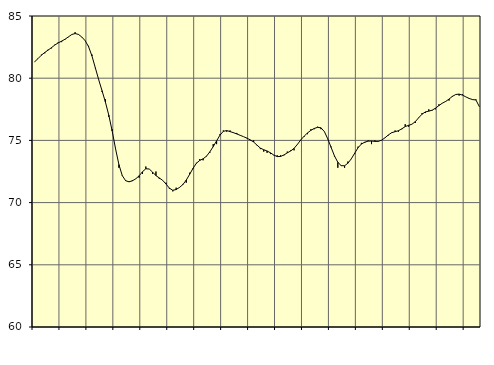
| Category | Piggar | Series 1 |
|---|---|---|
| nan | 81.3 | 81.32 |
| 87.0 | 81.6 | 81.58 |
| 87.0 | 81.9 | 81.85 |
| 87.0 | 82 | 82.07 |
| nan | 82.3 | 82.26 |
| 88.0 | 82.4 | 82.46 |
| 88.0 | 82.7 | 82.67 |
| 88.0 | 82.9 | 82.84 |
| nan | 82.9 | 82.98 |
| 89.0 | 83.1 | 83.13 |
| 89.0 | 83.3 | 83.32 |
| 89.0 | 83.5 | 83.51 |
| nan | 83.7 | 83.59 |
| 90.0 | 83.5 | 83.52 |
| 90.0 | 83.3 | 83.31 |
| 90.0 | 83 | 83.01 |
| nan | 82.6 | 82.53 |
| 91.0 | 81.9 | 81.79 |
| 91.0 | 80.8 | 80.84 |
| 91.0 | 79.9 | 79.88 |
| nan | 78.9 | 78.99 |
| 92.0 | 78.3 | 78.08 |
| 92.0 | 76.9 | 77.03 |
| 92.0 | 75.9 | 75.76 |
| nan | 74.4 | 74.34 |
| 93.0 | 72.8 | 73.06 |
| 93.0 | 72.2 | 72.17 |
| 93.0 | 71.8 | 71.76 |
| nan | 71.7 | 71.67 |
| 94.0 | 71.8 | 71.75 |
| 94.0 | 71.9 | 71.91 |
| 94.0 | 72 | 72.15 |
| nan | 72.3 | 72.48 |
| 95.0 | 72.9 | 72.72 |
| 95.0 | 72.7 | 72.7 |
| 95.0 | 72.3 | 72.45 |
| nan | 72.5 | 72.17 |
| 96.0 | 71.9 | 71.98 |
| 96.0 | 71.8 | 71.79 |
| 96.0 | 71.6 | 71.49 |
| nan | 71.1 | 71.16 |
| 97.0 | 70.9 | 70.99 |
| 97.0 | 71.2 | 71.05 |
| 97.0 | 71.2 | 71.22 |
| nan | 71.5 | 71.45 |
| 98.0 | 71.6 | 71.81 |
| 98.0 | 72.4 | 72.27 |
| 98.0 | 72.7 | 72.75 |
| nan | 73.2 | 73.16 |
| 99.0 | 73.5 | 73.39 |
| 99.0 | 73.4 | 73.52 |
| 99.0 | 73.7 | 73.73 |
| nan | 74 | 74.08 |
| 0.0 | 74.7 | 74.5 |
| 0.0 | 74.7 | 74.96 |
| 0.0 | 75.5 | 75.42 |
| nan | 75.8 | 75.73 |
| 1.0 | 75.7 | 75.79 |
| 1.0 | 75.8 | 75.71 |
| 1.0 | 75.6 | 75.62 |
| nan | 75.6 | 75.52 |
| 2.0 | 75.4 | 75.41 |
| 2.0 | 75.3 | 75.3 |
| 2.0 | 75.2 | 75.18 |
| nan | 75 | 75.04 |
| 3.0 | 75 | 74.87 |
| 3.0 | 74.6 | 74.62 |
| 3.0 | 74.3 | 74.38 |
| nan | 74.1 | 74.25 |
| 4.0 | 74 | 74.15 |
| 4.0 | 73.9 | 74 |
| 4.0 | 73.8 | 73.82 |
| nan | 73.8 | 73.7 |
| 5.0 | 73.8 | 73.71 |
| 5.0 | 73.8 | 73.83 |
| 5.0 | 74.1 | 74 |
| nan | 74.2 | 74.15 |
| 6.0 | 74.2 | 74.36 |
| 6.0 | 74.7 | 74.68 |
| 6.0 | 75 | 75.04 |
| nan | 75.3 | 75.34 |
| 7.0 | 75.5 | 75.6 |
| 7.0 | 75.9 | 75.81 |
| 7.0 | 75.9 | 75.96 |
| nan | 76.1 | 76.05 |
| 8.0 | 75.9 | 76.01 |
| 8.0 | 75.7 | 75.71 |
| 8.0 | 75.1 | 75.13 |
| nan | 74.5 | 74.44 |
| 9.0 | 73.7 | 73.75 |
| 9.0 | 72.8 | 73.24 |
| 9.0 | 73 | 72.97 |
| nan | 72.8 | 72.96 |
| 10.0 | 73.3 | 73.17 |
| 10.0 | 73.5 | 73.52 |
| 10.0 | 73.9 | 73.97 |
| nan | 74.5 | 74.41 |
| 11.0 | 74.8 | 74.71 |
| 11.0 | 74.8 | 74.86 |
| 11.0 | 75 | 74.94 |
| nan | 74.7 | 74.95 |
| 12.0 | 75 | 74.92 |
| 12.0 | 74.9 | 74.92 |
| 12.0 | 75 | 75.02 |
| nan | 75.2 | 75.21 |
| 13.0 | 75.4 | 75.44 |
| 13.0 | 75.6 | 75.62 |
| 13.0 | 75.8 | 75.7 |
| nan | 75.7 | 75.78 |
| 14.0 | 75.9 | 75.93 |
| 14.0 | 76.3 | 76.11 |
| 14.0 | 76.1 | 76.21 |
| nan | 76.3 | 76.3 |
| 15.0 | 76.4 | 76.51 |
| 15.0 | 76.8 | 76.82 |
| 15.0 | 77.2 | 77.11 |
| nan | 77.2 | 77.29 |
| 16.0 | 77.5 | 77.35 |
| 16.0 | 77.4 | 77.43 |
| 16.0 | 77.5 | 77.59 |
| nan | 77.9 | 77.8 |
| 17.0 | 78 | 77.99 |
| 17.0 | 78.1 | 78.13 |
| 17.0 | 78.2 | 78.32 |
| nan | 78.5 | 78.54 |
| 18.0 | 78.7 | 78.69 |
| 18.0 | 78.6 | 78.72 |
| 18.0 | 78.7 | 78.64 |
| nan | 78.5 | 78.5 |
| 19.0 | 78.4 | 78.37 |
| 19.0 | 78.3 | 78.28 |
| 19.0 | 78.3 | 78.25 |
| nan | 77.7 | 77.72 |